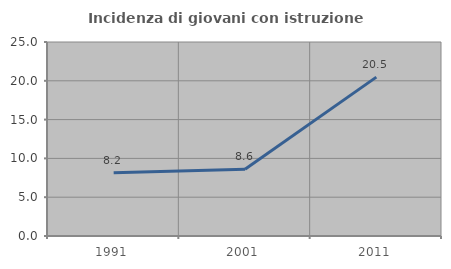
| Category | Incidenza di giovani con istruzione universitaria |
|---|---|
| 1991.0 | 8.15 |
| 2001.0 | 8.609 |
| 2011.0 | 20.476 |